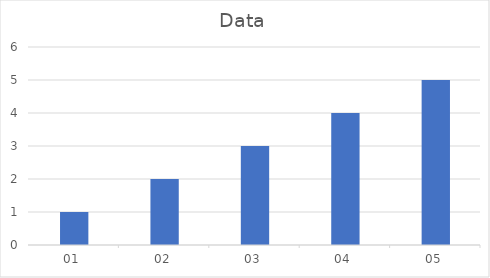
| Category | Data |
|---|---|
| 2020-01-01 | 1 |
| 2020-01-02 | 2 |
| 2020-01-03 | 3 |
| 2020-01-04 | 4 |
| 2020-01-05 | 5 |